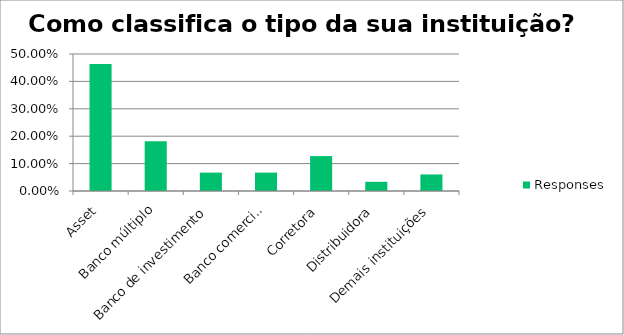
| Category | Responses |
|---|---|
| Asset | 0.463 |
| Banco múltiplo | 0.181 |
| Banco de investimento | 0.067 |
| Banco comercial | 0.067 |
| Corretora | 0.128 |
| Distribuidora | 0.034 |
| Demais instituições | 0.06 |